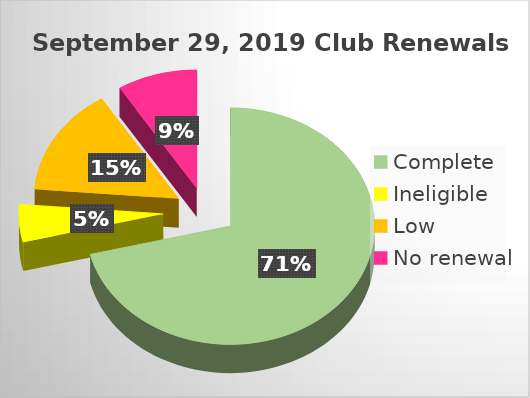
| Category | Series 0 |
|---|---|
| Complete | 0.712 |
| Ineligible | 0.051 |
| Low | 0.147 |
| No renewal | 0.09 |